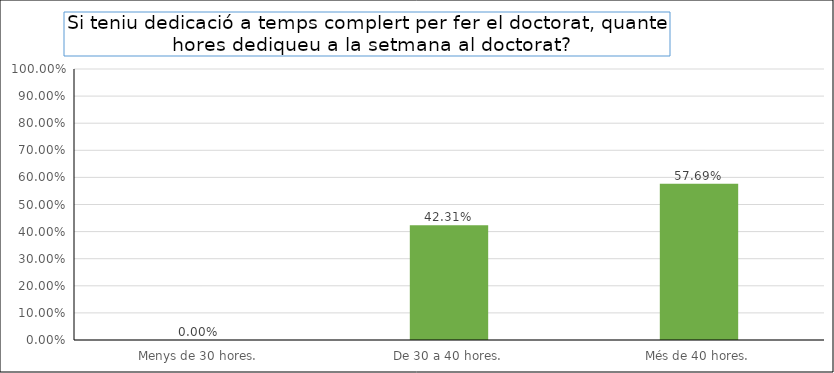
| Category | Series 0 |
|---|---|
| Menys de 30 hores. | 0 |
| De 30 a 40 hores. | 0.423 |
| Més de 40 hores. | 0.577 |